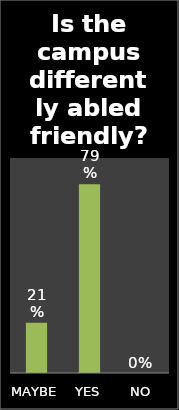
| Category | Series 0 |
|---|---|
| MAYBE | 0.21 |
| YES | 0.79 |
| NO | 0 |